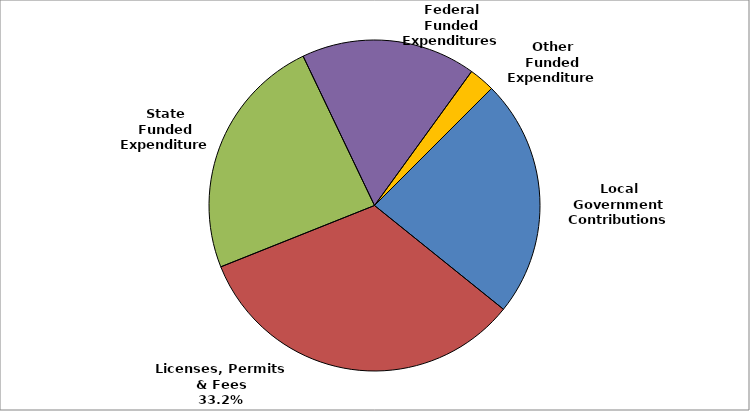
| Category | Series 0 |
|---|---|
| Local Government Contributions | 0.233 |
| Licenses, Permits & Fees | 0.332 |
| State Funded Expenditures | 0.239 |
| Federal Funded Expenditures | 0.171 |
| Other Funded Expenditures | 0.025 |